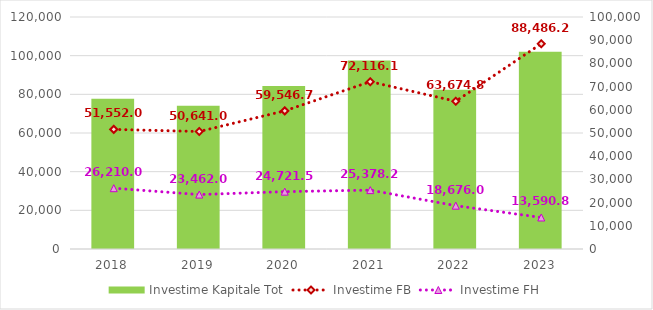
| Category | Investime Kapitale Tot |
|---|---|
| 2018.0 | 77762 |
| 2019.0 | 74103 |
| 2020.0 | 84268.26 |
| 2021.0 | 97494.37 |
| 2022.0 | 82350.92 |
| 2023.0 | 102077.08 |